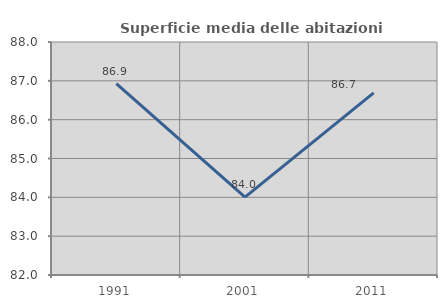
| Category | Superficie media delle abitazioni occupate |
|---|---|
| 1991.0 | 86.928 |
| 2001.0 | 84.006 |
| 2011.0 | 86.691 |